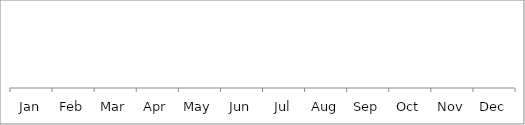
| Category | Series 0 |
|---|---|
| Jan | 0 |
| Feb | 0 |
| Mar | 0 |
| Apr | 0 |
| May | 0 |
| Jun | 0 |
| Jul | 0 |
| Aug | 0 |
| Sep | 0 |
| Oct | 0 |
| Nov | 0 |
| Dec | 0 |